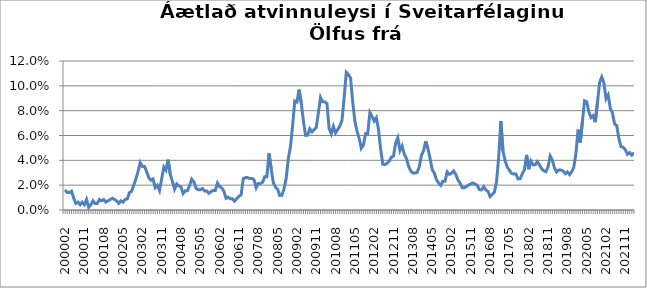
| Category | Series 0 |
|---|---|
| 200002 | 0.016 |
| 200003 | 0.014 |
| 200004 | 0.014 |
| 200005 | 0.015 |
| 200006 | 0.01 |
| 200007 | 0.005 |
| 200008 | 0.006 |
| 200009 | 0.004 |
| 200010 | 0.006 |
| 200011 | 0.004 |
| 200012 | 0.008 |
| 200101 | 0.002 |
| 200102 | 0.004 |
| 200103 | 0.007 |
| 200104 | 0.005 |
| 200105 | 0.005 |
| 200106 | 0.008 |
| 200107 | 0.007 |
| 200108 | 0.008 |
| 200109 | 0.006 |
| 200110 | 0.007 |
| 200111 | 0.008 |
| 200112 | 0.009 |
| 200201 | 0.008 |
| 200202 | 0.007 |
| 200203 | 0.005 |
| 200204 | 0.007 |
| 200205 | 0.006 |
| 200206 | 0.008 |
| 200207 | 0.009 |
| 200208 | 0.014 |
| 200209 | 0.015 |
| 200210 | 0.02 |
| 200211 | 0.025 |
| 200212 | 0.031 |
| 200301 | 0.038 |
| 200302 | 0.035 |
| 200303 | 0.035 |
| 200304 | 0.031 |
| 200305 | 0.026 |
| 200306 | 0.024 |
| 200307 | 0.025 |
| 200308 | 0.018 |
| 200309 | 0.02 |
| 200310 | 0.016 |
| 200311 | 0.025 |
| 200312 | 0.035 |
| 200401 | 0.032 |
| 200402 | 0.041 |
| 200403 | 0.029 |
| 200404 | 0.023 |
| 200405 | 0.017 |
| 200406 | 0.021 |
| 200407 | 0.019 |
| 200408 | 0.018 |
| 200409 | 0.013 |
| 200410 | 0.016 |
| 200411 | 0.016 |
| 200412 | 0.02 |
| 200501 | 0.025 |
| 200502 | 0.023 |
| 200503 | 0.018 |
| 200504 | 0.016 |
| 200505 | 0.016 |
| 200506 | 0.017 |
| 200507 | 0.015 |
| 200508 | 0.015 |
| 200509 | 0.013 |
| 200510 | 0.015 |
| 200511 | 0.016 |
| 200512 | 0.016 |
| 200601 | 0.022 |
| 200602 | 0.019 |
| 200603 | 0.018 |
| 200604 | 0.015 |
| 200605 | 0.009 |
| 200606 | 0.01 |
| 200607 | 0.009 |
| 200608 | 0.009 |
| 200609 | 0.007 |
| 200610 | 0.009 |
| 200611 | 0.011 |
| 200612 | 0.012 |
| 200701 | 0.025 |
| 200702 | 0.026 |
| 200703 | 0.026 |
| 200704 | 0.025 |
| 200705 | 0.025 |
| 200706 | 0.024 |
| 200707 | 0.018 |
| 200708 | 0.021 |
| 200709 | 0.021 |
| 200710 | 0.022 |
| 200711 | 0.027 |
| 200712 | 0.027 |
| 200801 | 0.046 |
| 200802 | 0.033 |
| 200803 | 0.022 |
| 200804 | 0.018 |
| 200805 | 0.017 |
| 200806 | 0.012 |
| 200807 | 0.012 |
| 200808 | 0.017 |
| 200809 | 0.025 |
| 200810 | 0.041 |
| 200811 | 0.051 |
| 200812 | 0.068 |
| 200901 | 0.088 |
| 200902 | 0.087 |
| 200903 | 0.097 |
| 200904 | 0.087 |
| 200905 | 0.072 |
| 200906 | 0.06 |
| 200907 | 0.06 |
| 200908 | 0.065 |
| 200909 | 0.063 |
| 200910 | 0.065 |
| 200911 | 0.066 |
| 200912 | 0.078 |
| 201001 | 0.091 |
| 201002 | 0.087 |
| 201003 | 0.087 |
| 201004 | 0.086 |
| 201005 | 0.066 |
| 201006 | 0.061 |
| 201007 | 0.067 |
| 201008 | 0.062 |
| 201009 | 0.065 |
| 201010 | 0.068 |
| 201011 | 0.072 |
| 201012 | 0.09 |
| 201101 | 0.111 |
| 201102 | 0.109 |
| 201103 | 0.106 |
| 201104 | 0.087 |
| 201105 | 0.072 |
| 201106 | 0.063 |
| 201107 | 0.058 |
| 201108 | 0.05 |
| 201109 | 0.052 |
| 201110 | 0.062 |
| 201111 | 0.062 |
| 201112 | 0.079 |
| 201201 | 0.075 |
| 201202 | 0.072 |
| 201203 | 0.074 |
| 201204 | 0.065 |
| 201205 | 0.049 |
| 201206 | 0.037 |
| 201207 | 0.037 |
| 201208 | 0.038 |
| 201209 | 0.039 |
| 201210 | 0.043 |
| 201211 | 0.043 |
| 201212 | 0.054 |
| 201301 | 0.058 |
| 201302 | 0.048 |
| 201303 | 0.052 |
| 201304 | 0.045 |
| 201305 | 0.042 |
| 201306 | 0.035 |
| 201307 | 0.032 |
| 201308 | 0.03 |
| 201309 | 0.03 |
| 201310 | 0.03 |
| 201311 | 0.035 |
| 201312 | 0.044 |
| 201401 | 0.048 |
| 201402 | 0.055 |
| 201403 | 0.05 |
| 201404 | 0.042 |
| 201405 | 0.033 |
| 201406 | 0.03 |
| 201407 | 0.024 |
| 201408 | 0.022 |
| 201409 | 0.02 |
| 201410 | 0.023 |
| 201411 | 0.023 |
| 201412 | 0.031 |
| 201501 | 0.029 |
| 201502 | 0.03 |
| 201503 | 0.031 |
| 201504 | 0.029 |
| 201505 | 0.024 |
| 201506 | 0.022 |
| 201507 | 0.018 |
| 201508 | 0.018 |
| 201509 | 0.019 |
| 201510 | 0.02 |
| 201511 | 0.021 |
| 201512 | 0.022 |
| 201601 | 0.021 |
| 201602 | 0.02 |
| 201603 | 0.016 |
| 201604 | 0.016 |
| 201605 | 0.019 |
| 201606 | 0.016 |
| 201607 | 0.015 |
| 201608 | 0.011 |
| 201609 | 0.013 |
| 201610 | 0.014 |
| 201611 | 0.023 |
| 201612 | 0.042 |
| 201701 | 0.072 |
| 201702 | 0.047 |
| 201703 | 0.04 |
| 201704 | 0.035 |
| 201705 | 0.032 |
| 201706 | 0.029 |
| 201707 | 0.029 |
| 201708 | 0.029 |
| 201709 | 0.025 |
| 201710 | 0.025 |
| 201711 | 0.029 |
| 201712 | 0.032 |
| 201801 | 0.044 |
| 201802 | 0.033 |
| 201803 | 0.039 |
| 201804 | 0.036 |
| 201805 | 0.036 |
| 201806 | 0.039 |
| 201807 | 0.036 |
| 201808 | 0.033 |
| 201809 | 0.032 |
| 201810 | 0.031 |
| 201811 | 0.035 |
| 201812 | 0.043 |
| 201901 | 0.04 |
| 201902 | 0.034 |
| 201903 | 0.031 |
| 201904 | 0.032 |
| 201905 | 0.032 |
| 201906 | 0.031 |
| 201907 | 0.029 |
| 201908 | 0.031 |
| 201909 | 0.028 |
| 201910 | 0.031 |
| 201911 | 0.035 |
| 201912 | 0.046 |
| 202001 | 0.065 |
| 202002 | 0.054 |
| 202003 | 0.071 |
| 202004 | 0.088 |
| 202005 | 0.087 |
| 202006 | 0.079 |
| 202007 | 0.074 |
| 202008 | 0.076 |
| 202009 | 0.071 |
| 202010 | 0.086 |
| 202011 | 0.103 |
| 202012 | 0.107 |
| 202101 | 0.102 |
| 202102 | 0.09 |
| 202103 | 0.093 |
| 202104 | 0.082 |
| 202105 | 0.078 |
| 202106 | 0.069 |
| 202107 | 0.068 |
| 202108 | 0.057 |
| 202109 | 0.051 |
| 202110 | 0.051 |
| 202111 | 0.048 |
| 202112 | 0.045 |
| 202201 | 0.046 |
| 202202 | 0.044 |
| 202203 | 0.046 |